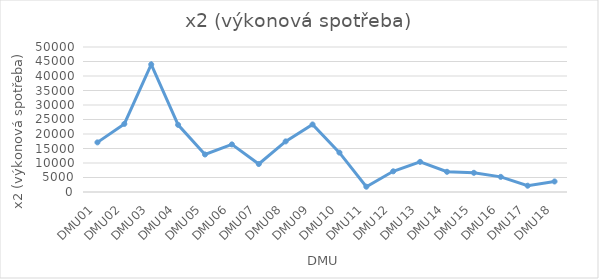
| Category | x2 (výkonová spotřeba) |
|---|---|
| DMU01 | 17110 |
| DMU02 | 23482 |
| DMU03 | 43992 |
| DMU04 | 23150 |
| DMU05 | 12941 |
| DMU06 | 16414 |
| DMU07 | 9648 |
| DMU08 | 17447 |
| DMU09 | 23289 |
| DMU10 | 13582 |
| DMU11 | 1831 |
| DMU12 | 7133 |
| DMU13 | 10395 |
| DMU14 | 6974 |
| DMU15 | 6620 |
| DMU16 | 5218 |
| DMU17 | 2171 |
| DMU18 | 3631 |